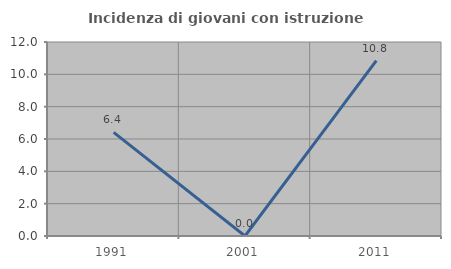
| Category | Incidenza di giovani con istruzione universitaria |
|---|---|
| 1991.0 | 6.41 |
| 2001.0 | 0 |
| 2011.0 | 10.843 |